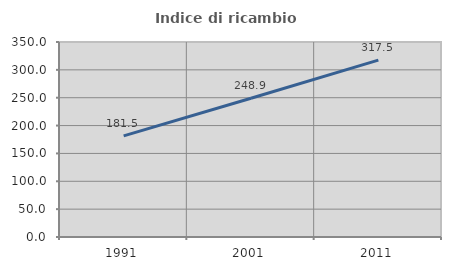
| Category | Indice di ricambio occupazionale  |
|---|---|
| 1991.0 | 181.522 |
| 2001.0 | 248.936 |
| 2011.0 | 317.544 |